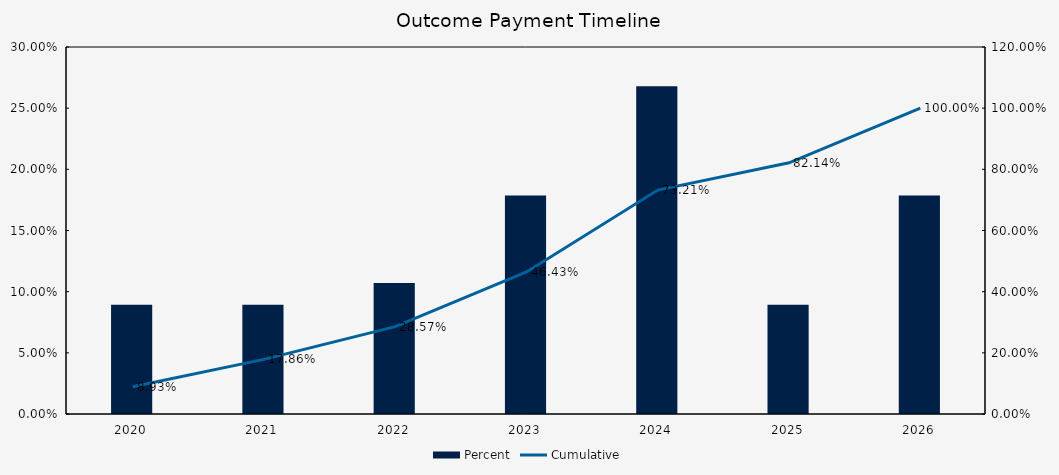
| Category | Percent |
|---|---|
| 2020.0 | 0.089 |
| 2021.0 | 0.089 |
| 2022.0 | 0.107 |
| 2023.0 | 0.179 |
| 2024.0 | 0.268 |
| 2025.0 | 0.089 |
| 2026.0 | 0.179 |